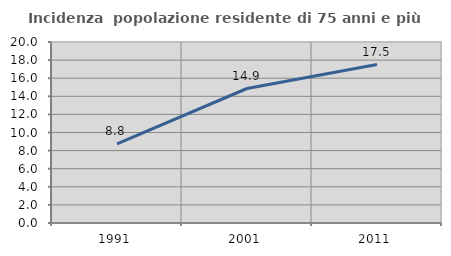
| Category | Incidenza  popolazione residente di 75 anni e più |
|---|---|
| 1991.0 | 8.756 |
| 2001.0 | 14.861 |
| 2011.0 | 17.507 |